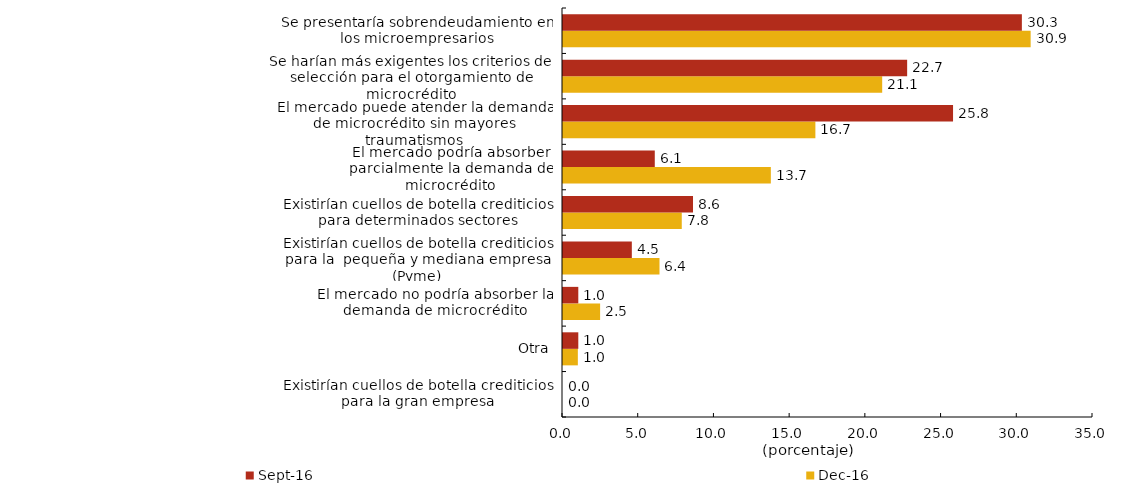
| Category | dic-16 | sep-16 |
|---|---|---|
| Existirían cuellos de botella crediticios para la gran empresa | 0 | 0 |
| Otra | 0.98 | 1.01 |
| El mercado no podría absorber la demanda de microcrédito | 2.451 | 1.01 |
| Existirían cuellos de botella crediticios para la  pequeña y mediana empresa (Pyme) | 6.373 | 4.545 |
| Existirían cuellos de botella crediticios para determinados sectores | 7.843 | 8.586 |
| El mercado podría absorber parcialmente la demanda de microcrédito | 13.725 | 6.061 |
| El mercado puede atender la demanda de microcrédito sin mayores traumatismos | 16.667 | 25.758 |
| Se harían más exigentes los criterios de selección para el otorgamiento de microcrédito | 21.078 | 22.727 |
| Se presentaría sobrendeudamiento en los microempresarios | 30.882 | 30.303 |